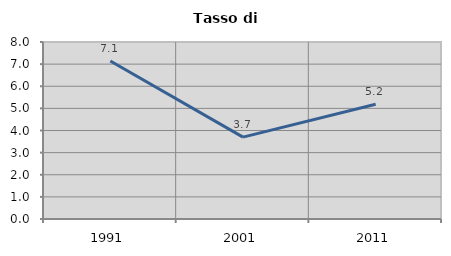
| Category | Tasso di disoccupazione   |
|---|---|
| 1991.0 | 7.143 |
| 2001.0 | 3.7 |
| 2011.0 | 5.187 |